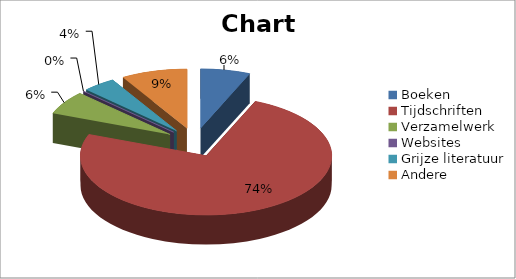
| Category | Series 0 |
|---|---|
| Boeken | 6.383 |
| Tijdschriften | 74.468 |
| Verzamelwerk | 6.383 |
| Websites | 0 |
| Grijze literatuur | 4.255 |
| Andere | 8.511 |